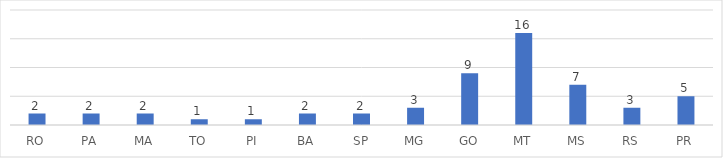
| Category | Series 0 |
|---|---|
| RO | 2 |
| PA | 2 |
| MA | 2 |
| TO | 1 |
| PI | 1 |
| BA | 2 |
| SP | 2 |
| MG | 3 |
| GO | 9 |
| MT | 16 |
| MS | 7 |
| RS | 3 |
| PR | 5 |